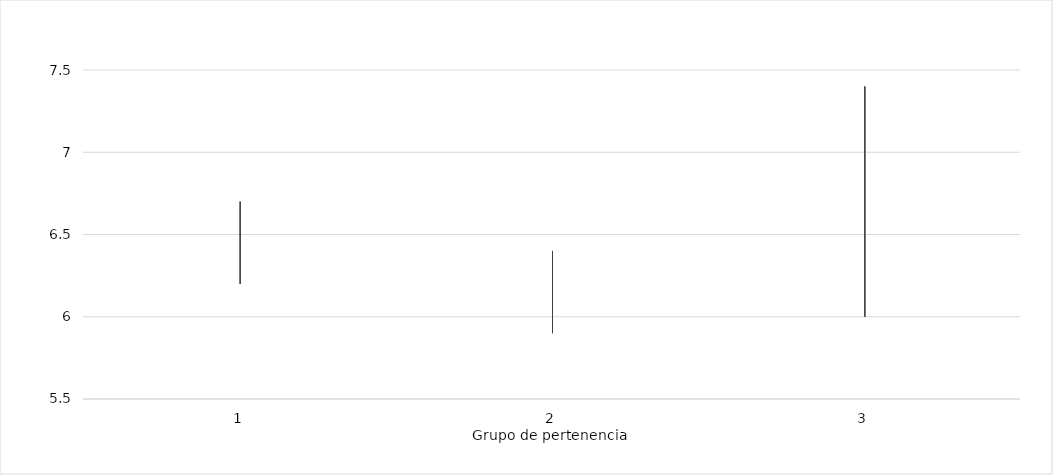
| Category | Series 0 | Series 1 | Series 2 |
|---|---|---|---|
| 0 | 6.7 | 6.4 | 6.2 |
| 1 | 6.4 | 6.2 | 5.9 |
| 2 | 7.4 | 6.7 | 6 |